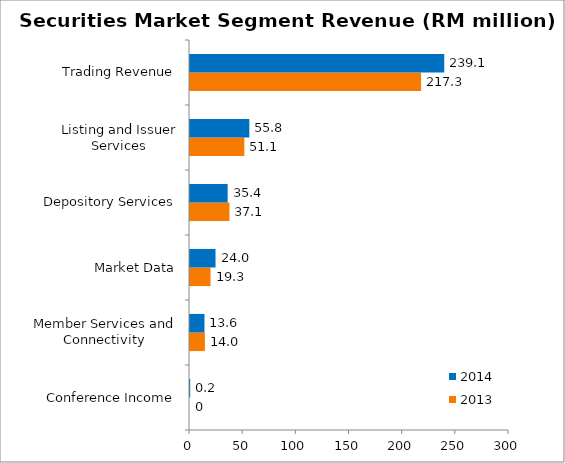
| Category | 2013 | 2014 |
|---|---|---|
| Conference Income | 0 | 0.2 |
| Member Services and Connectivity | 14 | 13.6 |
| Market Data | 19.3 | 24 |
| Depository Services | 37.1 | 35.4 |
| Listing and Issuer Services | 51.1 | 55.8 |
| Trading Revenue | 217.3 | 239.1 |